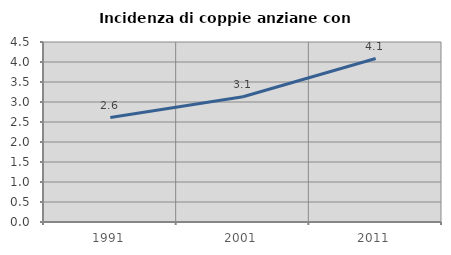
| Category | Incidenza di coppie anziane con figli |
|---|---|
| 1991.0 | 2.612 |
| 2001.0 | 3.133 |
| 2011.0 | 4.087 |